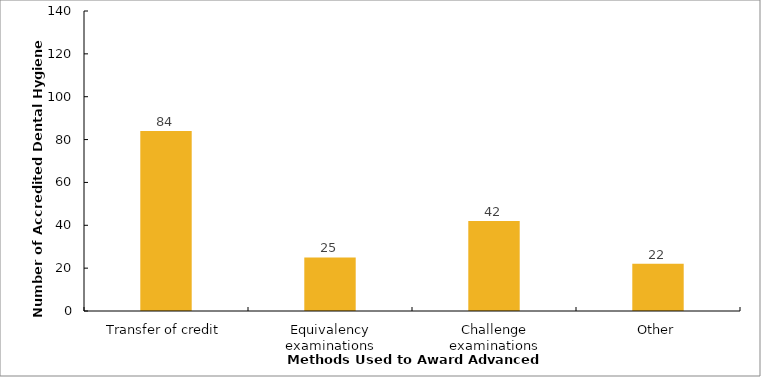
| Category | 2015-16 |
|---|---|
| Transfer of credit | 84 |
| Equivalency examinations | 25 |
| Challenge examinations | 42 |
| Other | 22 |